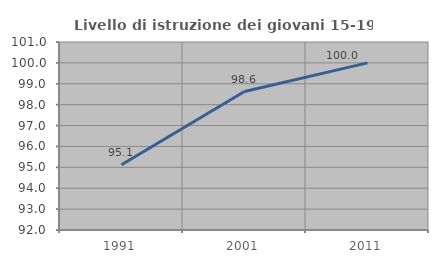
| Category | Livello di istruzione dei giovani 15-19 anni |
|---|---|
| 1991.0 | 95.122 |
| 2001.0 | 98.63 |
| 2011.0 | 100 |